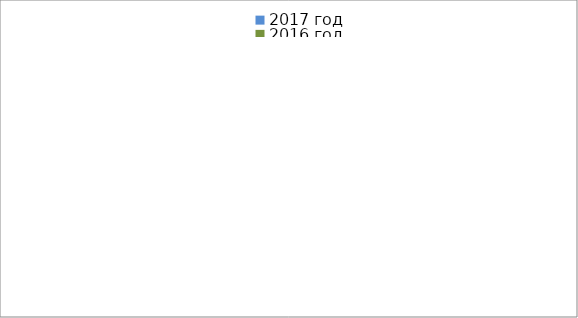
| Category | 2017 год | 2016 год |
|---|---|---|
|  - поджог | 0 | 3 |
|  - неосторожное обращение с огнём | 1 | 0 |
|  - НПТЭ электрооборудования | 2 | 1 |
|  - НПУ и Э печей | 13 | 10 |
|  - НПУ и Э транспортных средств | 6 | 10 |
|   -Шалость с огнем детей | 0 | 0 |
|  -НППБ при эксплуатации эл.приборов | 6 | 8 |
|  - курение | 7 | 1 |
| - прочие | 10 | 7 |
| - не установленные причины | 0 | 0 |